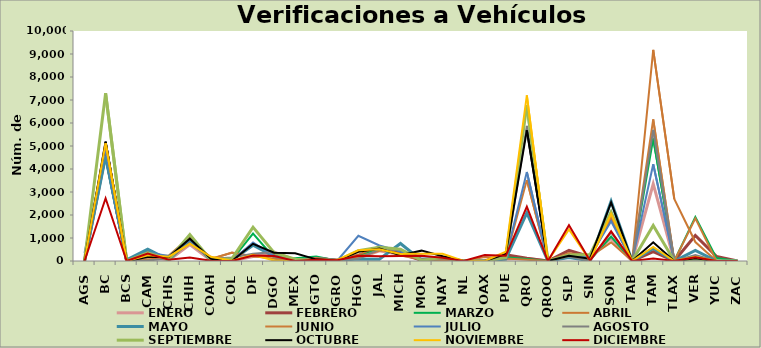
| Category | ENERO | FEBRERO | MARZO | ABRIL | MAYO | JUNIO | JULIO | AGOSTO | SEPTIEMBRE | OCTUBRE | NOVIEMBRE | DICIEMBRE |
|---|---|---|---|---|---|---|---|---|---|---|---|---|
| AGS | 0 | 0 | 0 | 0 | 0 | 0 | 350 | 7 | 19 | 8 | 0 | 0 |
| BC | 4631 | 4649 | 4938 | 5085 | 4547 | 5163 | 4858 | 5056 | 7294 | 5187 | 5119 | 2727 |
| BCS | 36 | 0 | 0 | 0 | 52 | 0 | 0 | 0 | 0 | 0 | 0 | 0 |
| CAM | 241 | 388 | 291 | 72 | 509 | 226 | 370 | 25 | 359 | 176 | 252 | 320 |
| CHIS | 29 | 138 | 41 | 116 | 51 | 239 | 216 | 98 | 63 | 178 | 188 | 57 |
| CHIH | 712 | 850 | 878 | 879 | 937 | 1043 | 928 | 772 | 1150 | 971 | 749 | 153 |
| COAH | 24 | 133 | 58 | 80 | 44 | 95 | 116 | 102 | 39 | 92 | 181 | 9 |
| COL | 8 | 46 | 54 | 368 | 40 | 359 | 11 | 157 | 102 | 0 | 12 | 0 |
| DF | 191 | 720 | 1193 | 209 | 683 | 194 | 801 | 311 | 1472 | 747 | 275 | 238 |
| DGO | 393 | 245 | 143 | 99 | 207 | 194 | 218 | 389 | 362 | 359 | 18 | 213 |
| MEX | 47 | 25 | 124 | 0 | 30 | 0 | 0 | 0 | 80 | 334 | 0 | 0 |
| GTO | 134 | 120 | 196 | 129 | 122 | 135 | 0 | 5 | 22 | 72 | 0 | 55 |
| GRO | 10 | 32 | 12 | 56 | 24 | 23 | 11 | 37 | 2 | 26 | 46 | 30 |
| HGO | 121 | 219 | 214 | 279 | 92 | 191 | 1094 | 102 | 449 | 398 | 468 | 232 |
| JAL | 443 | 581 | 553 | 642 | 73 | 446 | 673 | 510 | 602 | 539 | 510 | 209 |
| MICH | 280 | 340 | 474 | 239 | 761 | 502 | 414 | 478 | 516 | 255 | 303 | 214 |
| MOR | 54 | 29 | 24 | 71 | 28 | 31 | 102 | 94 | 26 | 450 | 320 | 225 |
| NAY | 13 | 2 | 28 | 42 | 139 | 89 | 160 | 114 | 159 | 205 | 310 | 145 |
| NL | 0 | 0 | 0 | 0 | 0 | 0 | 0 | 0 | 0 | 0 | 0 | 0 |
| OAX | 0 | 2 | 0 | 0 | 0 | 170 | 0 | 0 | 0 | 0 | 0 | 261 |
| PUE | 85 | 269 | 167 | 109 | 84 | 121 | 149 | 135 | 156 | 308 | 401 | 225 |
| QRO | 110 | 116 | 91 | 53 | 2089 | 3518 | 3866 | 5877 | 6777 | 5683 | 7205 | 2363 |
| QROO | 0 | 0 | 0 | 0 | 0 | 0 | 0 | 0 | 0 | 0 | 0 | 0 |
| SLP | 187 | 461 | 207 | 348 | 156 | 324 | 236 | 191 | 264 | 232 | 1375 | 1552 |
| SIN | 168 | 184 | 47 | 185 | 10 | 137 | 196 | 0 | 280 | 103 | 21 | 14 |
| SON | 993 | 1903 | 1060 | 812 | 2599 | 1916 | 1728 | 1246 | 2138 | 2550 | 2054 | 1290 |
| TAB | 0 | 0 | 0 | 0 | 0 | 0 | 0 | 0 | 0 | 0 | 0 | 0 |
| TAM | 3350 | 411 | 5327 | 9183 | 545 | 6155 | 4210 | 5700 | 1542 | 816 | 608 | 113 |
| TLAX | 0 | 0 | 0 | 2700 | 0 | 0 | 0 | 0 | 0 | 0 | 0 | 0 |
| VER | 81 | 1108 | 1917 | 824 | 463 | 1851 | 73 | 264 | 96 | 122 | 188 | 160 |
| YUC | 0 | 199 | 136 | 0 | 0 | 0 | 0 | 0 | 0 | 0 | 0 | 0 |
| ZAC | 0 | 0 | 0 | 0 | 0 | 0 | 0 | 0 | 0 | 0 | 0 | 0 |